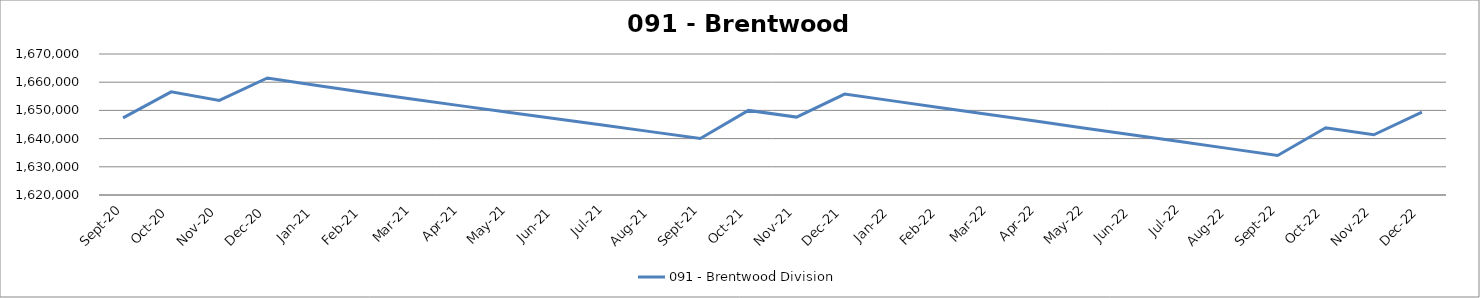
| Category | 091 - Brentwood Division |
|---|---|
| 2020-09-30 | 1647330.73 |
| 2020-10-31 | 1656578.65 |
| 2020-11-30 | 1653559.72 |
| 2020-12-31 | 1661509.03 |
| 2021-01-31 | 1658915.13 |
| 2021-02-28 | 1656416.93 |
| 2021-03-31 | 1654023.2 |
| 2021-04-30 | 1651696.481 |
| 2021-05-31 | 1649369.742 |
| 2021-06-30 | 1647043.023 |
| 2021-07-31 | 1644716.304 |
| 2021-08-31 | 1642389.585 |
| 2021-09-30 | 1640062.915 |
| 2021-10-31 | 1650003.046 |
| 2021-11-30 | 1647627.055 |
| 2021-12-31 | 1655794.274 |
| 2022-01-31 | 1653375.934 |
| 2022-02-28 | 1650957.595 |
| 2022-03-31 | 1648539.255 |
| 2022-04-30 | 1646120.915 |
| 2022-05-31 | 1643702.556 |
| 2022-06-30 | 1641284.216 |
| 2022-07-31 | 1638865.877 |
| 2022-08-31 | 1636447.537 |
| 2022-09-30 | 1634029.247 |
| 2022-10-31 | 1643828.486 |
| 2022-11-30 | 1641360.874 |
| 2022-12-31 | 1649394.124 |